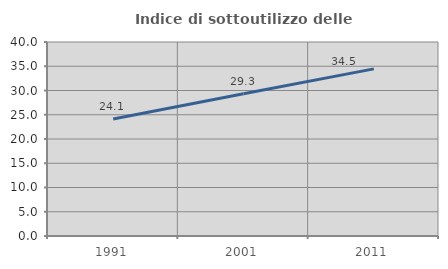
| Category | Indice di sottoutilizzo delle abitazioni  |
|---|---|
| 1991.0 | 24.142 |
| 2001.0 | 29.313 |
| 2011.0 | 34.462 |